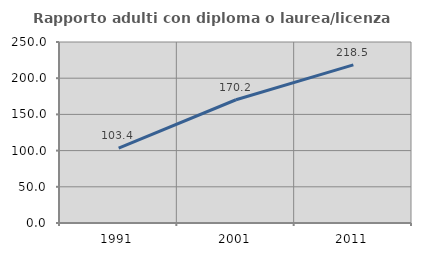
| Category | Rapporto adulti con diploma o laurea/licenza media  |
|---|---|
| 1991.0 | 103.385 |
| 2001.0 | 170.225 |
| 2011.0 | 218.484 |